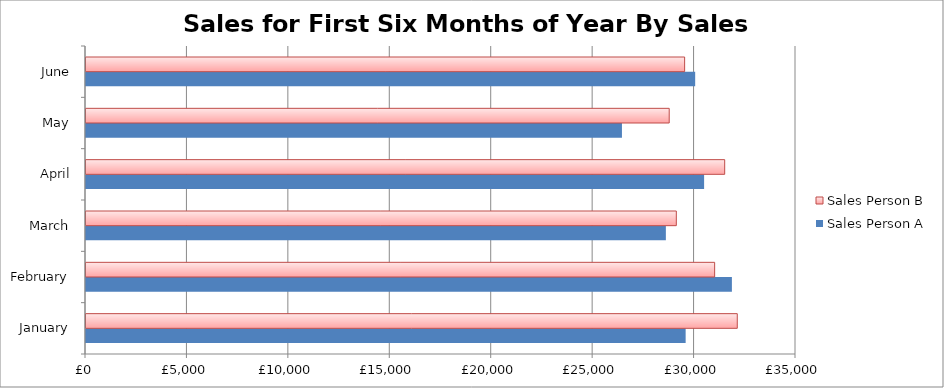
| Category | Sales Person A | Sales Person B |
|---|---|---|
| January | 29560 | 32105 |
| February | 31840 | 30990 |
| March | 28585 | 29100 |
| April | 30470 | 31485 |
| May | 26420 | 28750 |
| June | 30030 | 29510 |